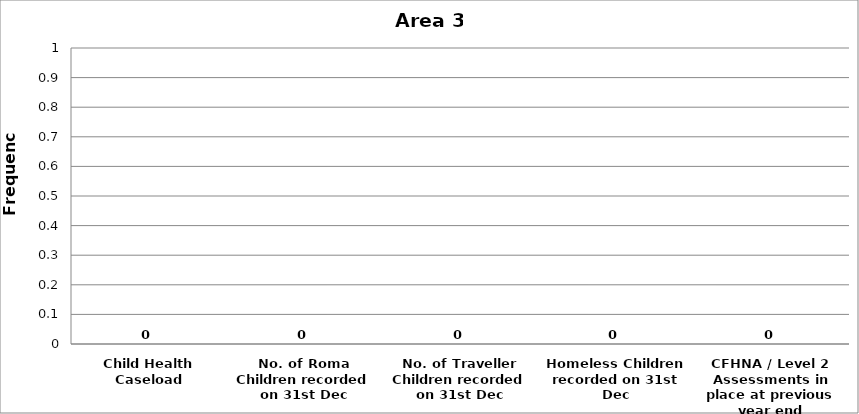
| Category | Area 3 |
|---|---|
| Child Health Caseload | 0 |
| No. of Roma Children recorded on 31st Dec | 0 |
| No. of Traveller Children recorded on 31st Dec | 0 |
| Homeless Children recorded on 31st Dec | 0 |
| CFHNA / Level 2 Assessments in place at previous year end | 0 |